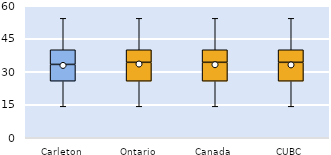
| Category | 25th | 50th | 75th |
|---|---|---|---|
| Carleton | 25.714 | 7.619 | 6.667 |
| Ontario | 25.714 | 8.571 | 5.714 |
| Canada | 25.714 | 8.571 | 5.714 |
| CUBC | 25.714 | 8.571 | 5.714 |